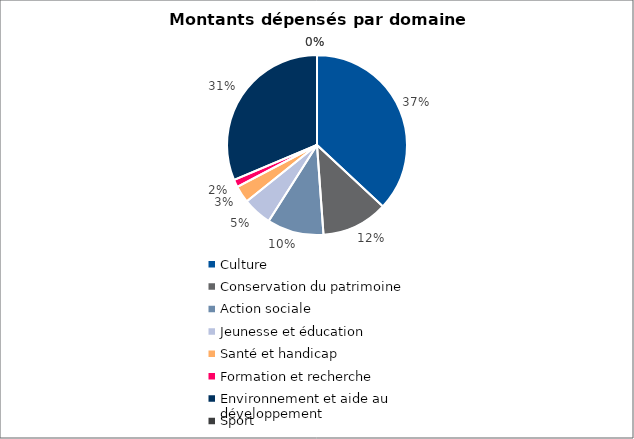
| Category | Series 0 |
|---|---|
| Culture | 11184541 |
| Conservation du patrimoine | 3605000 |
| Action sociale | 3074610 |
| Jeunesse et éducation | 1586500 |
| Santé et handicap | 927500 |
| Formation et recherche | 410540 |
| Environnement et aide au
développement | 9489000 |
| Sport | 0 |
| Autres projets d’utilité publique | 0 |